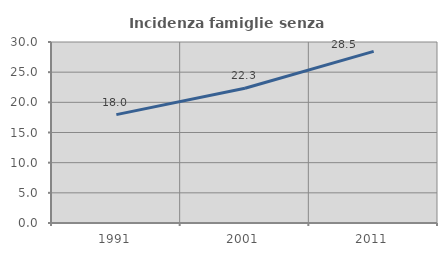
| Category | Incidenza famiglie senza nuclei |
|---|---|
| 1991.0 | 17.961 |
| 2001.0 | 22.329 |
| 2011.0 | 28.45 |